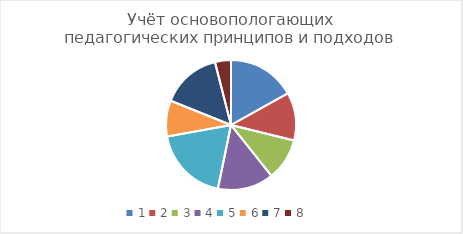
| Category | Series 0 |
|---|---|
| 0 | 0.272 |
| 1 | 0.192 |
| 2 | 0.168 |
| 3 | 0.224 |
| 4 | 0.304 |
| 5 | 0.144 |
| 6 | 0.24 |
| 7 | 0.064 |